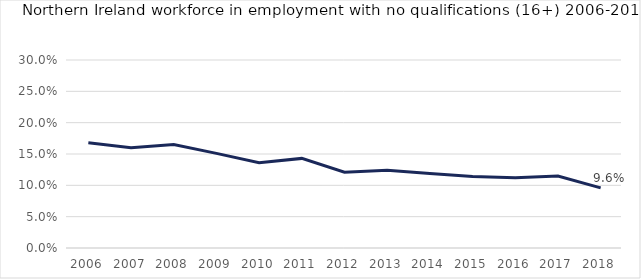
| Category | Proportion |
|---|---|
| 2006 | 0.168 |
| 2007 | 0.16 |
| 2008 | 0.165 |
| 2009 | 0.151 |
| 2010 | 0.136 |
| 2011 | 0.143 |
| 2012 | 0.121 |
| 2013 | 0.124 |
| 2014 | 0.119 |
| 2015 | 0.114 |
| 2016 | 0.112 |
| 2017 | 0.115 |
| 2018 | 0.096 |